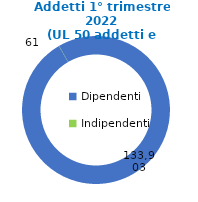
| Category | Series 0 |
|---|---|
| Dipendenti | 133903 |
| Indipendenti | 61 |